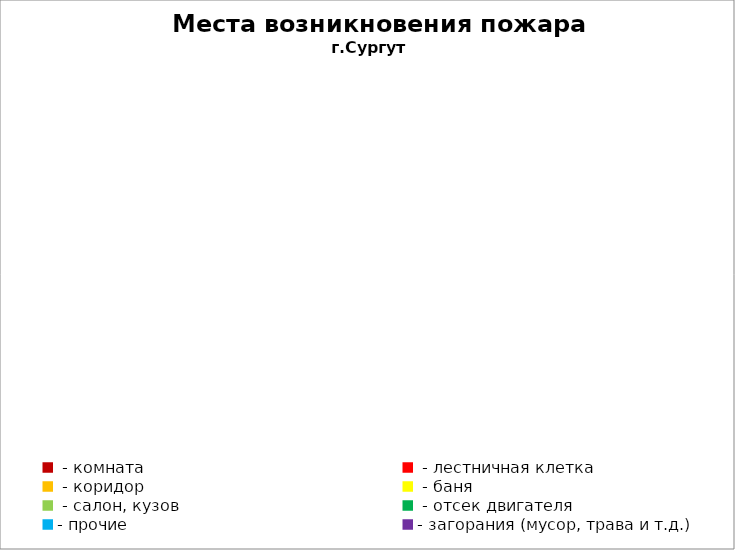
| Category | Места возникновения пожара |
|---|---|
|  - комната | 48 |
|  - лестничная клетка | 16 |
|  - коридор | 9 |
|  - баня | 20 |
|  - салон, кузов | 9 |
|  - отсек двигателя | 22 |
| - прочие | 89 |
| - загорания (мусор, трава и т.д.)  | 148 |